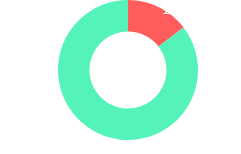
| Category | Series 0 |
|---|---|
| 0 | 0.146 |
| 1 | 0.854 |